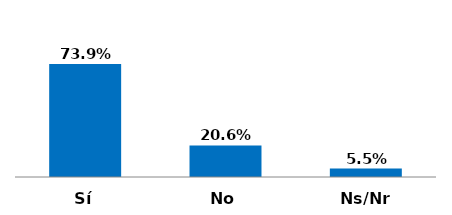
| Category | Series 0 |
|---|---|
| Sí | 0.739 |
| No | 0.206 |
| Ns/Nr | 0.055 |